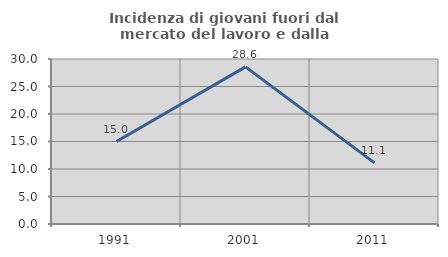
| Category | Incidenza di giovani fuori dal mercato del lavoro e dalla formazione  |
|---|---|
| 1991.0 | 15 |
| 2001.0 | 28.571 |
| 2011.0 | 11.111 |